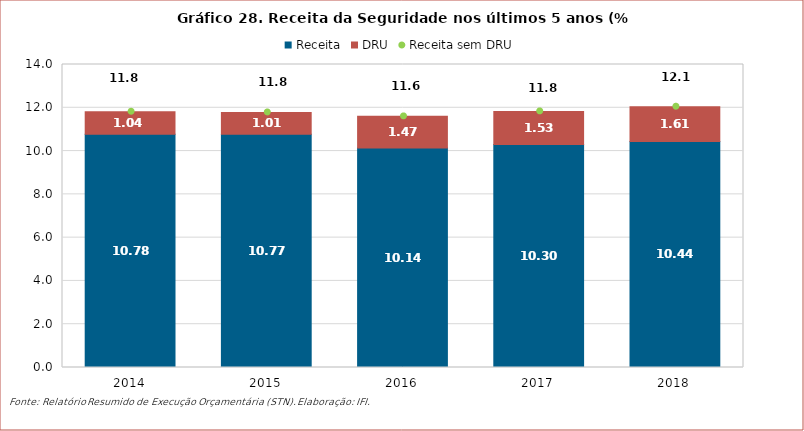
| Category | Receita | DRU |
|---|---|---|
| 2014 | 10.78 | 1.036 |
| 2015 | 10.774 | 1.011 |
| 2016 | 10.137 | 1.467 |
| 2017 | 10.303 | 1.532 |
| 2018 | 10.444 | 1.606 |